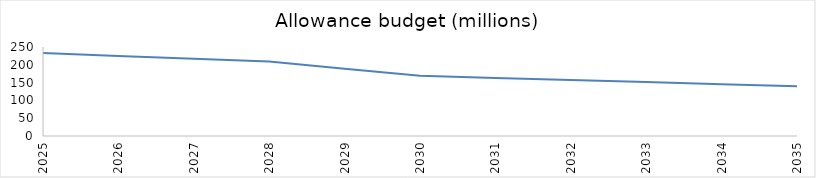
| Category | Series 0 |
|---|---|
| 2025.0 | 233.015 |
| 2026.0 | 225.021 |
| 2027.0 | 217.027 |
| 2028.0 | 209.033 |
| 2029.0 | 189.048 |
| 2030.0 | 169.063 |
| 2031.0 | 163.161 |
| 2032.0 | 157.259 |
| 2033.0 | 151.357 |
| 2034.0 | 145.455 |
| 2035.0 | 139.553 |